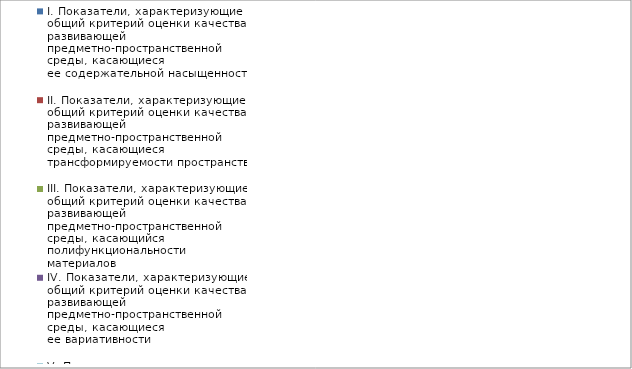
| Category | I. Показатели, характеризующие общий критерий оценки качества развивающей предметно-пространственной среды, касающиеся ее содержательной насыщенности | II. Показатели, характеризующие общий критерий оценки качества развивающей предметно-пространственной среды, касающиеся трансформируемости пространства | III. Показатели, характеризующие общий критерий оценки качества развивающей предметно-пространственной среды, касающийся полифункциональности материалов | IV. Показатели, характеризующие общий критерий оценки качества развивающей предметно-пространственной среды, касающиеся ее вариативности | V. Показатели, характеризующие общий критерий оценки качества развивающей предметно-пространственной среды, касающиеся ее доступности | VI. Показатели, характеризующие общий критерий оценки качества развивающей предметно-пространственной среды, касающиеся безопасности предметно-пространственной среды |
|---|---|---|---|---|---|---|
| Солнышко | 0.955 | 0.833 | 0.833 | 1 | 1 | 0.95 |